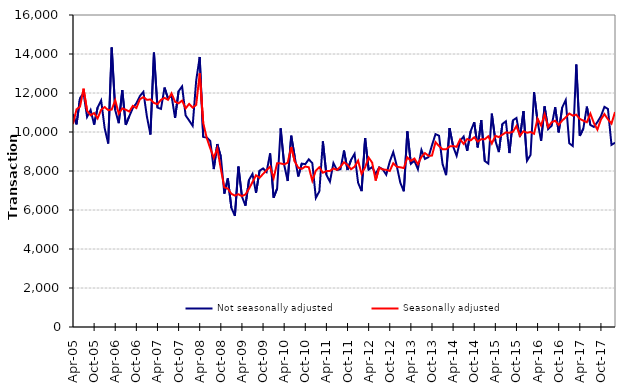
| Category | Not seasonally adjusted | Seasonally adjusted |
|---|---|---|
| 2005-04-01 | 10920 | 10410 |
| 2005-05-01 | 10390 | 11160 |
| 2005-06-01 | 11740 | 11300 |
| 2005-07-01 | 12000 | 12220 |
| 2005-08-01 | 10770 | 11090 |
| 2005-09-01 | 11130 | 10860 |
| 2005-10-01 | 10380 | 10970 |
| 2005-11-01 | 11260 | 10700 |
| 2005-12-01 | 11620 | 11140 |
| 2006-01-01 | 10190 | 11280 |
| 2006-02-01 | 9410 | 11120 |
| 2006-03-01 | 14330 | 11150 |
| 2006-04-01 | 11120 | 11630 |
| 2006-05-01 | 10450 | 10940 |
| 2006-06-01 | 12150 | 11210 |
| 2006-07-01 | 10360 | 11140 |
| 2006-08-01 | 10810 | 11050 |
| 2006-09-01 | 11230 | 11340 |
| 2006-10-01 | 11470 | 11230 |
| 2006-11-01 | 11840 | 11680 |
| 2006-12-01 | 12060 | 11790 |
| 2007-01-01 | 10790 | 11650 |
| 2007-02-01 | 9870 | 11670 |
| 2007-03-01 | 14070 | 11490 |
| 2007-04-01 | 11250 | 11430 |
| 2007-05-01 | 11180 | 11650 |
| 2007-06-01 | 12280 | 11750 |
| 2007-07-01 | 11720 | 11650 |
| 2007-08-01 | 11860 | 11980 |
| 2007-09-01 | 10720 | 11550 |
| 2007-10-01 | 12090 | 11470 |
| 2007-11-01 | 12340 | 11610 |
| 2007-12-01 | 10850 | 11210 |
| 2008-01-01 | 10590 | 11440 |
| 2008-02-01 | 10320 | 11250 |
| 2008-03-01 | 12640 | 11390 |
| 2008-04-01 | 13850 | 13010 |
| 2008-05-01 | 9750 | 10470 |
| 2008-06-01 | 9720 | 9690 |
| 2008-07-01 | 9540 | 9160 |
| 2008-08-01 | 8100 | 8680 |
| 2008-09-01 | 9380 | 9160 |
| 2008-10-01 | 8740 | 8110 |
| 2008-11-01 | 6840 | 7160 |
| 2008-12-01 | 7620 | 7100 |
| 2009-01-01 | 6110 | 6830 |
| 2009-02-01 | 5700 | 6740 |
| 2009-03-01 | 8230 | 6810 |
| 2009-04-01 | 6690 | 6710 |
| 2009-05-01 | 6220 | 6800 |
| 2009-06-01 | 7540 | 7090 |
| 2009-07-01 | 7850 | 7430 |
| 2009-08-01 | 6880 | 7780 |
| 2009-09-01 | 8010 | 7650 |
| 2009-10-01 | 8130 | 7850 |
| 2009-11-01 | 7950 | 8040 |
| 2009-12-01 | 8900 | 8220 |
| 2010-01-01 | 6630 | 7630 |
| 2010-02-01 | 7100 | 8400 |
| 2010-03-01 | 10190 | 8390 |
| 2010-04-01 | 8320 | 8340 |
| 2010-05-01 | 7490 | 8430 |
| 2010-06-01 | 9810 | 9230 |
| 2010-07-01 | 8720 | 8490 |
| 2010-08-01 | 7720 | 8170 |
| 2010-09-01 | 8380 | 8110 |
| 2010-10-01 | 8350 | 8230 |
| 2010-11-01 | 8600 | 8190 |
| 2010-12-01 | 8400 | 7500 |
| 2011-01-01 | 6620 | 8020 |
| 2011-02-01 | 6960 | 8190 |
| 2011-03-01 | 9520 | 7910 |
| 2011-04-01 | 7810 | 8000 |
| 2011-05-01 | 7450 | 8000 |
| 2011-06-01 | 8410 | 8130 |
| 2011-07-01 | 8050 | 8060 |
| 2011-08-01 | 8090 | 8220 |
| 2011-09-01 | 9050 | 8450 |
| 2011-10-01 | 8050 | 8310 |
| 2011-11-01 | 8570 | 8090 |
| 2011-12-01 | 8880 | 8220 |
| 2012-01-01 | 7400 | 8530 |
| 2012-02-01 | 6970 | 7850 |
| 2012-03-01 | 9690 | 8190 |
| 2012-04-01 | 8070 | 8690 |
| 2012-05-01 | 8200 | 8430 |
| 2012-06-01 | 7850 | 7510 |
| 2012-07-01 | 8190 | 8170 |
| 2012-08-01 | 8090 | 8080 |
| 2012-09-01 | 7810 | 8060 |
| 2012-10-01 | 8480 | 8000 |
| 2012-11-01 | 8970 | 8400 |
| 2012-12-01 | 8250 | 8220 |
| 2013-01-01 | 7400 | 8190 |
| 2013-02-01 | 6960 | 8150 |
| 2013-03-01 | 10030 | 8700 |
| 2013-04-01 | 8370 | 8520 |
| 2013-05-01 | 8530 | 8640 |
| 2013-06-01 | 8090 | 8350 |
| 2013-07-01 | 9080 | 8720 |
| 2013-08-01 | 8620 | 8920 |
| 2013-09-01 | 8710 | 8780 |
| 2013-10-01 | 9320 | 8790 |
| 2013-11-01 | 9890 | 9480 |
| 2013-12-01 | 9810 | 9280 |
| 2014-01-01 | 8360 | 9110 |
| 2014-02-01 | 7790 | 9110 |
| 2014-03-01 | 10200 | 9260 |
| 2014-04-01 | 9260 | 9280 |
| 2014-05-01 | 8780 | 9240 |
| 2014-06-01 | 9550 | 9620 |
| 2014-07-01 | 9770 | 9390 |
| 2014-08-01 | 9030 | 9640 |
| 2014-09-01 | 10050 | 9570 |
| 2014-10-01 | 10500 | 9730 |
| 2014-11-01 | 9210 | 9510 |
| 2014-12-01 | 10610 | 9630 |
| 2015-01-01 | 8510 | 9630 |
| 2015-02-01 | 8380 | 9780 |
| 2015-03-01 | 10940 | 9410 |
| 2015-04-01 | 9560 | 9800 |
| 2015-05-01 | 8970 | 9740 |
| 2015-06-01 | 10410 | 9860 |
| 2015-07-01 | 10550 | 9980 |
| 2015-08-01 | 8920 | 9960 |
| 2015-09-01 | 10600 | 10010 |
| 2015-10-01 | 10720 | 10310 |
| 2015-11-01 | 9740 | 9810 |
| 2015-12-01 | 11070 | 10040 |
| 2016-01-01 | 8520 | 9960 |
| 2016-02-01 | 8820 | 10000 |
| 2016-03-01 | 12040 | 9910 |
| 2016-04-01 | 10530 | 10680 |
| 2016-05-01 | 9550 | 10330 |
| 2016-06-01 | 11310 | 10910 |
| 2016-07-01 | 10150 | 10250 |
| 2016-08-01 | 10320 | 10500 |
| 2016-09-01 | 11270 | 10580 |
| 2016-10-01 | 9980 | 10360 |
| 2016-11-01 | 11260 | 10590 |
| 2016-12-01 | 11640 | 10750 |
| 2017-01-01 | 9420 | 10950 |
| 2017-02-01 | 9280 | 10840 |
| 2017-03-01 | 13460 | 10890 |
| 2017-04-01 | 9800 | 10670 |
| 2017-05-01 | 10170 | 10580 |
| 2017-06-01 | 11300 | 10500 |
| 2017-07-01 | 10360 | 10940 |
| 2017-08-01 | 10260 | 10460 |
| 2017-09-01 | 10510 | 10120 |
| 2017-10-01 | 10810 | 10640 |
| 2017-11-01 | 11290 | 10920 |
| 2017-12-01 | 11180 | 10650 |
| 2018-01-01 | 9340 | 10430 |
| 2018-02-01 | 9450 | 11020 |